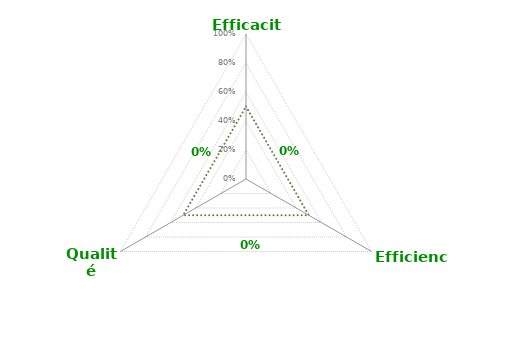
| Category | Seuil 17050 | Performance |
|---|---|---|
| Efficacité | 0.5 | 0 |
| Efficience | 0.5 | 0 |
| Qualité perçue | 0.5 | 0 |